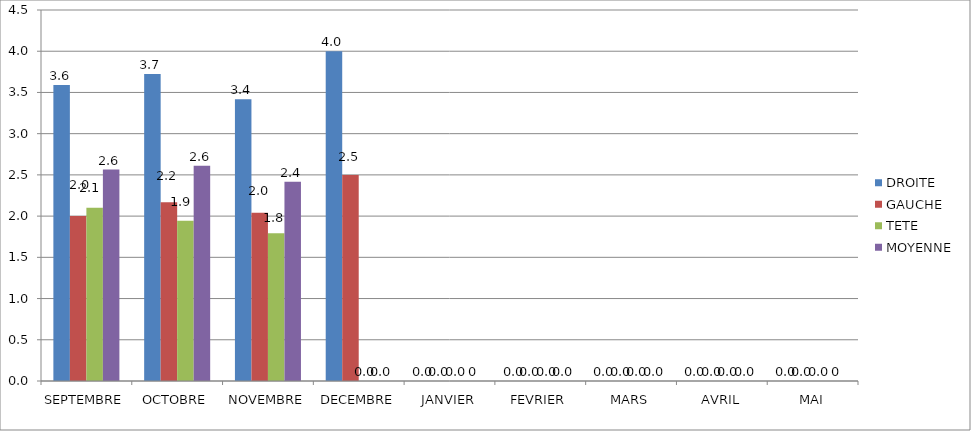
| Category | DROITE | GAUCHE | TETE | MOYENNE |
|---|---|---|---|---|
| SEPTEMBRE | 3.59 | 2 | 2.103 | 2.564 |
| OCTOBRE | 3.722 | 2.167 | 1.944 | 2.611 |
| NOVEMBRE | 3.417 | 2.042 | 1.792 | 2.417 |
| DECEMBRE | 4 | 2.5 | 0 | 0 |
| JANVIER | 0 | 0 | 0 | 0 |
| FEVRIER | 0 | 0 | 0 | 0 |
| MARS | 0 | 0 | 0 | 0 |
| AVRIL | 0 | 0 | 0 | 0 |
| MAI | 0 | 0 | 0 | 0 |